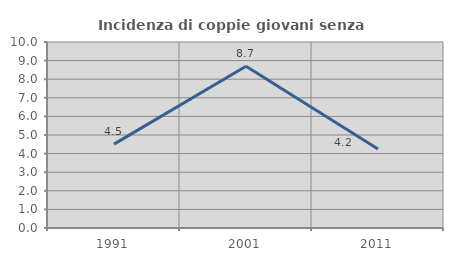
| Category | Incidenza di coppie giovani senza figli |
|---|---|
| 1991.0 | 4.511 |
| 2001.0 | 8.696 |
| 2011.0 | 4.242 |